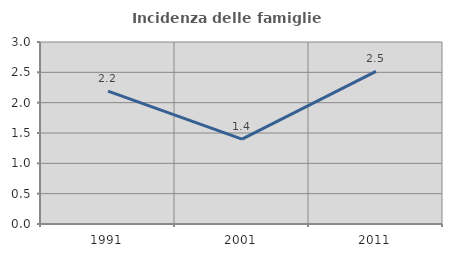
| Category | Incidenza delle famiglie numerose |
|---|---|
| 1991.0 | 2.192 |
| 2001.0 | 1.398 |
| 2011.0 | 2.516 |